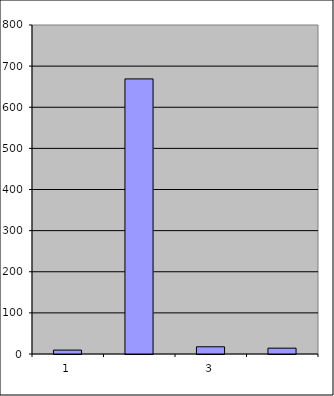
| Category | Series 0 |
|---|---|
| 0 | 9.5 |
| 1 | 668.891 |
| 2 | 17.549 |
| 3 | 14.202 |